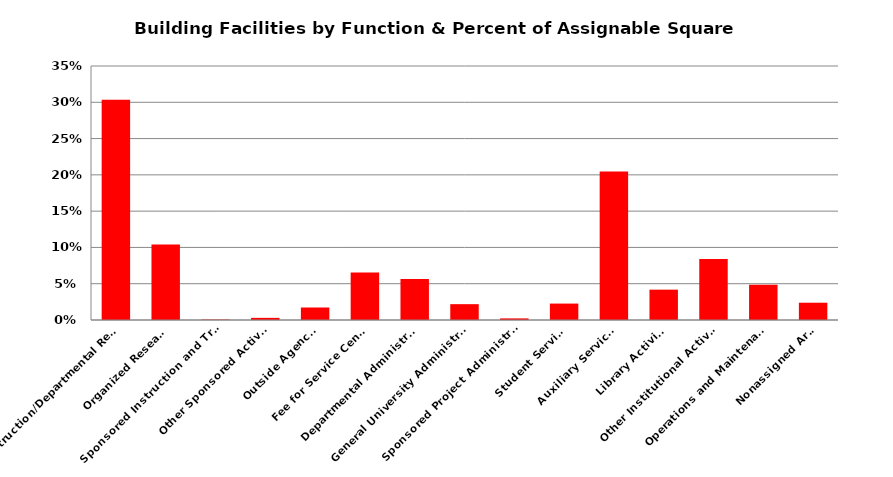
| Category | Percent |
|---|---|
| Instruction/Departmental Research | 0.304 |
| Organized Research | 0.104 |
| Sponsored Instruction and Training | 0.001 |
| Other Sponsored Activities | 0.003 |
| Outside Agencies | 0.017 |
| Fee for Service Centers | 0.065 |
| Departmental Administration | 0.057 |
| General University Administration | 0.022 |
| Sponsored Project Administration | 0.002 |
| Student Services | 0.023 |
| Auxiliary Services  | 0.205 |
| Library Activities | 0.042 |
| Other Institutional Activities  | 0.084 |
| Operations and Maintenance   | 0.049 |
| Nonassigned Areas | 0.024 |